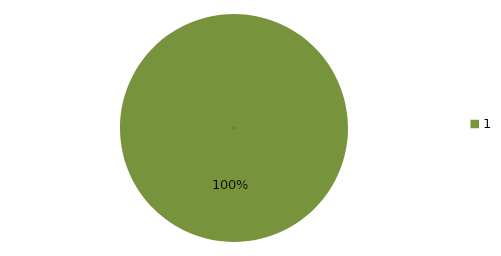
| Category | Series 1 | Series 0 |
|---|---|---|
| 0 | 1 | 1 |